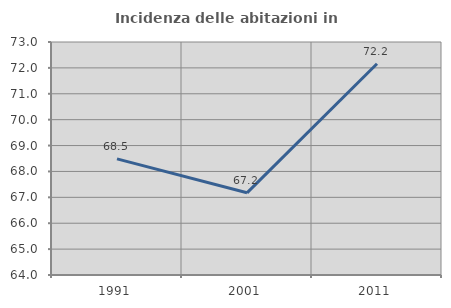
| Category | Incidenza delle abitazioni in proprietà  |
|---|---|
| 1991.0 | 68.485 |
| 2001.0 | 67.174 |
| 2011.0 | 72.158 |